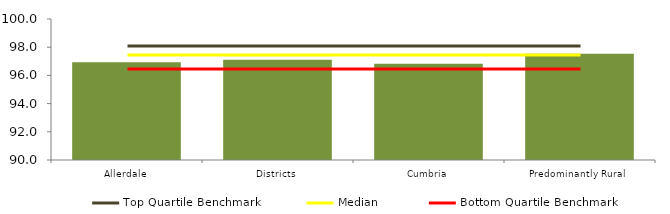
| Category | Block Data |
|---|---|
| Allerdale | 96.93 |
| Districts | 97.11 |
| Cumbria | 96.822 |
|  Predominantly Rural  | 97.54 |